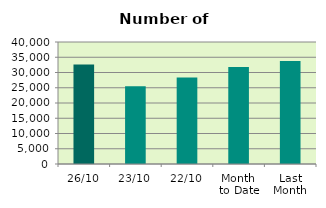
| Category | Series 0 |
|---|---|
| 26/10 | 32586 |
| 23/10 | 25464 |
| 22/10 | 28362 |
| Month 
to Date | 31767 |
| Last
Month | 33733.273 |